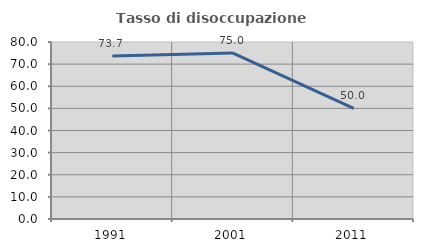
| Category | Tasso di disoccupazione giovanile  |
|---|---|
| 1991.0 | 73.684 |
| 2001.0 | 75 |
| 2011.0 | 50 |